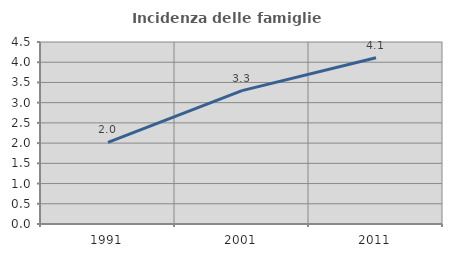
| Category | Incidenza delle famiglie numerose |
|---|---|
| 1991.0 | 2.02 |
| 2001.0 | 3.297 |
| 2011.0 | 4.11 |